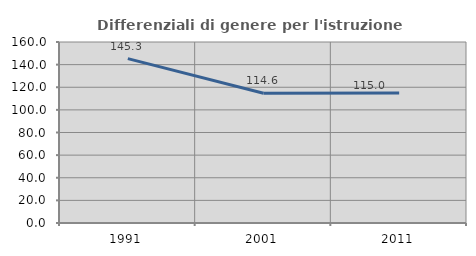
| Category | Differenziali di genere per l'istruzione superiore |
|---|---|
| 1991.0 | 145.279 |
| 2001.0 | 114.646 |
| 2011.0 | 114.995 |